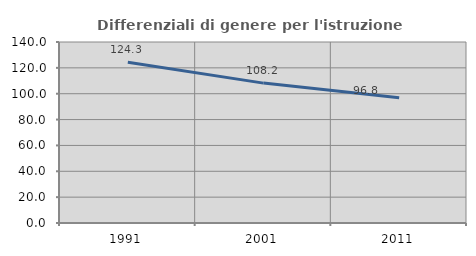
| Category | Differenziali di genere per l'istruzione superiore |
|---|---|
| 1991.0 | 124.285 |
| 2001.0 | 108.204 |
| 2011.0 | 96.796 |